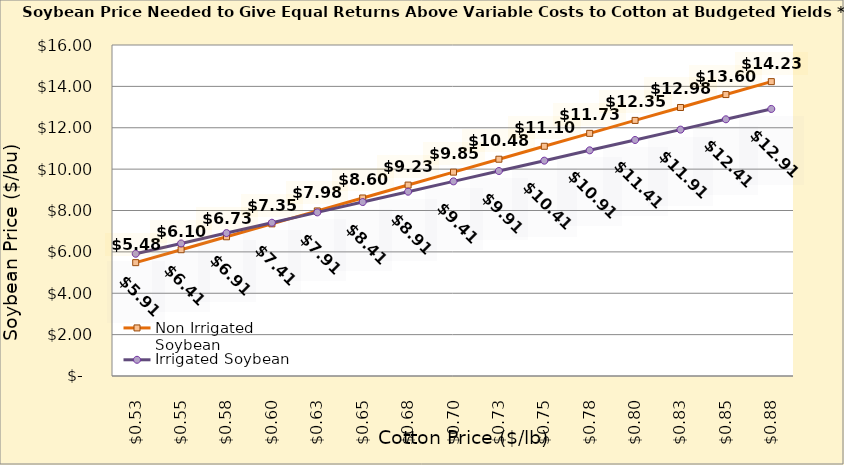
| Category | Non Irrigated Soybean | Irrigated Soybean |
|---|---|---|
| 0.5249999999999998 | 5.48 | 5.909 |
| 0.5499999999999998 | 6.105 | 6.409 |
| 0.5749999999999998 | 6.73 | 6.909 |
| 0.5999999999999999 | 7.355 | 7.409 |
| 0.6249999999999999 | 7.98 | 7.909 |
| 0.6499999999999999 | 8.605 | 8.409 |
| 0.6749999999999999 | 9.23 | 8.909 |
| 0.7 | 9.855 | 9.409 |
| 0.725 | 10.48 | 9.909 |
| 0.75 | 11.105 | 10.409 |
| 0.775 | 11.73 | 10.909 |
| 0.8 | 12.355 | 11.409 |
| 0.8250000000000001 | 12.98 | 11.909 |
| 0.8500000000000001 | 13.605 | 12.409 |
| 0.8750000000000001 | 14.23 | 12.909 |